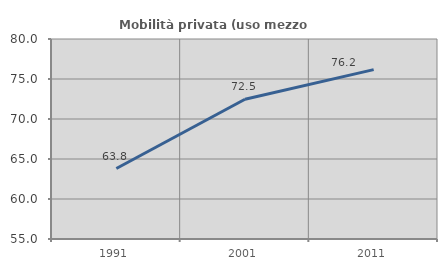
| Category | Mobilità privata (uso mezzo privato) |
|---|---|
| 1991.0 | 63.807 |
| 2001.0 | 72.466 |
| 2011.0 | 76.168 |